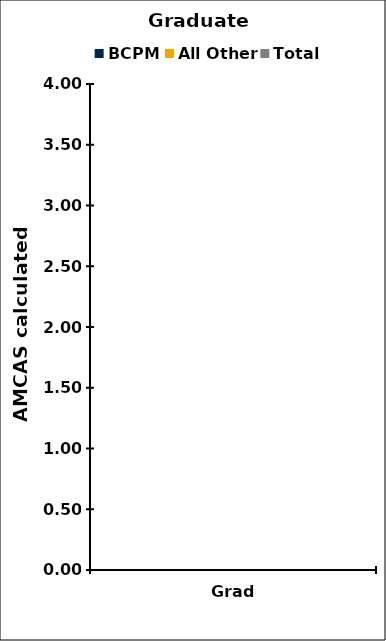
| Category | BCPM | All Other | Total |
|---|---|---|---|
| Grad | 0 | 0 | 0 |